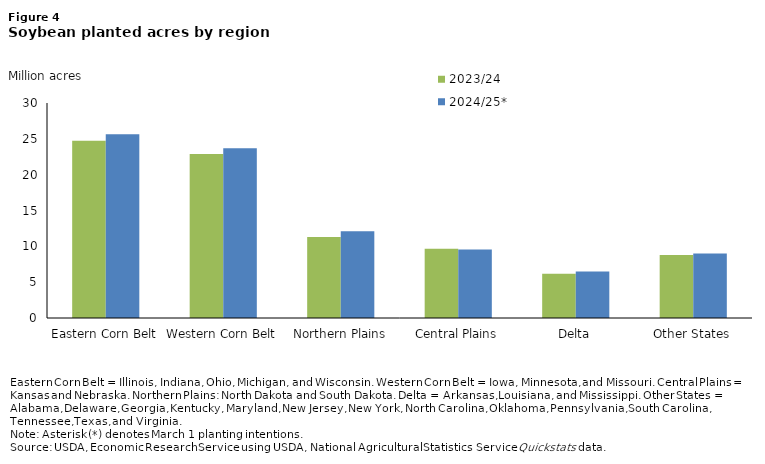
| Category | 2023/24 | 2024/25* |
|---|---|---|
| Eastern Corn Belt | 24.75 | 25.65 |
| Western Corn Belt | 22.9 | 23.7 |
| Northern Plains | 11.3 | 12.1 |
| Central Plains | 9.68 | 9.55 |
| Delta | 6.19 | 6.5 |
| Other States | 8.78 | 9 |